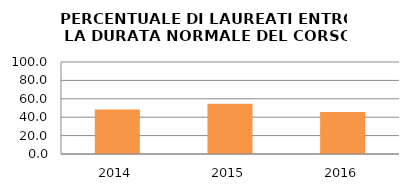
| Category | 2014 2015 2016 |
|---|---|
| 2014.0 | 48.485 |
| 2015.0 | 54.545 |
| 2016.0 | 45.714 |